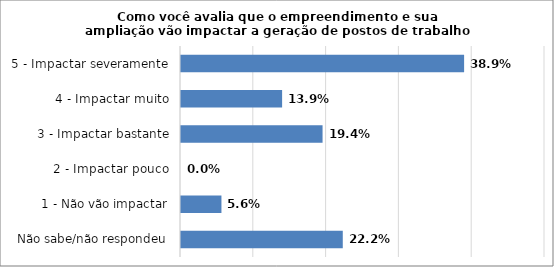
| Category | Series 0 |
|---|---|
| Não sabe/não respondeu | 0.222 |
| 1 - Não vão impactar | 0.056 |
| 2 - Impactar pouco | 0 |
| 3 - Impactar bastante | 0.194 |
| 4 - Impactar muito | 0.139 |
| 5 - Impactar severamente | 0.389 |